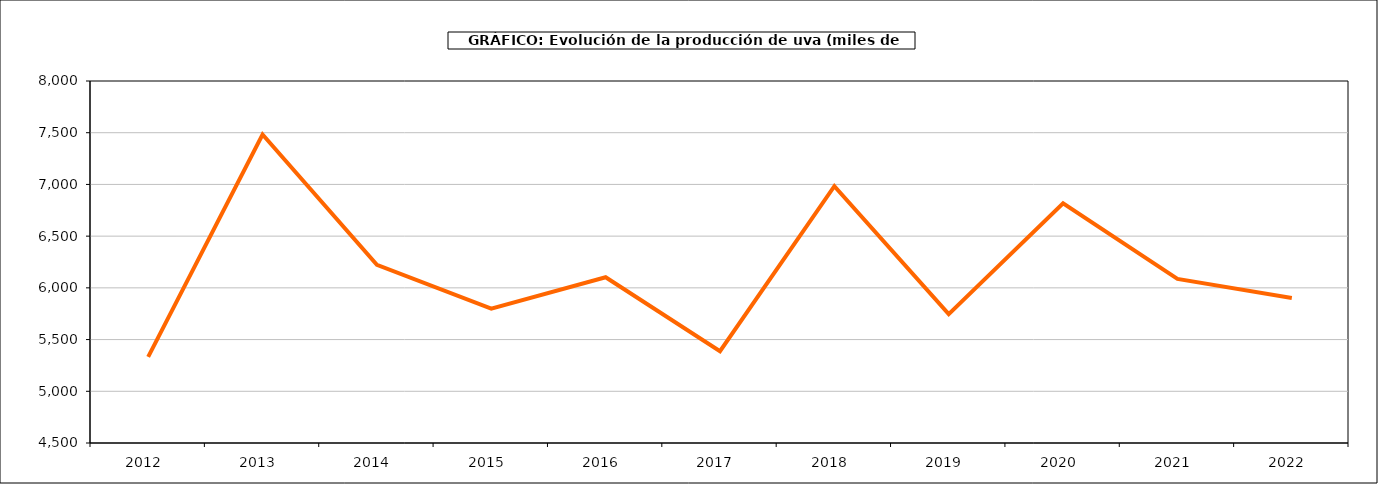
| Category | producción |
|---|---|
| 2012  | 5332.163 |
| 2013  | 7482.539 |
| 2014  | 6221.76 |
| 2015  | 5799.127 |
| 2016  | 6102.851 |
| 2017  | 5387.379 |
| 2018  | 6983.401 |
| 2019  | 5745.451 |
| 2020  | 6817.766 |
| 2021  | 6086.921 |
| 2022  | 5902.042 |